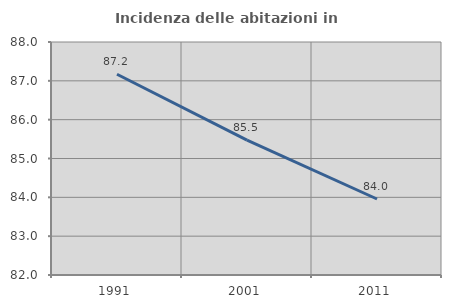
| Category | Incidenza delle abitazioni in proprietà  |
|---|---|
| 1991.0 | 87.17 |
| 2001.0 | 85.475 |
| 2011.0 | 83.957 |